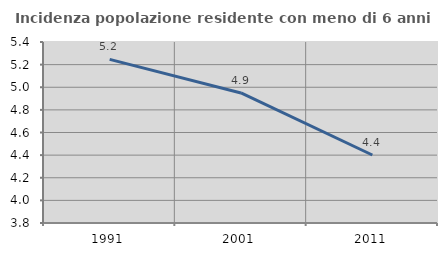
| Category | Incidenza popolazione residente con meno di 6 anni |
|---|---|
| 1991.0 | 5.246 |
| 2001.0 | 4.949 |
| 2011.0 | 4.401 |